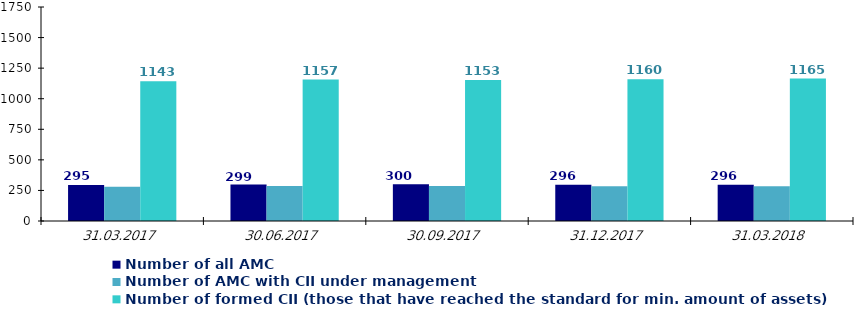
| Category | Number of registered CII per one AMC | Number of all AMC    | Number of AMC with CII under management | Number of formed CII (those that have reached the standard for min. amount of assets) |
|---|---|---|---|---|
| 31.03.2017 |  | 295 | 280 | 1143 |
| 30.06.2017 |  | 299 | 287 | 1157 |
| 30.09.2017 |  | 300 | 287 | 1153 |
| 31.12.2017 |  | 296 | 284 | 1160 |
| 31.03.2018 |  | 296 | 284 | 1165 |